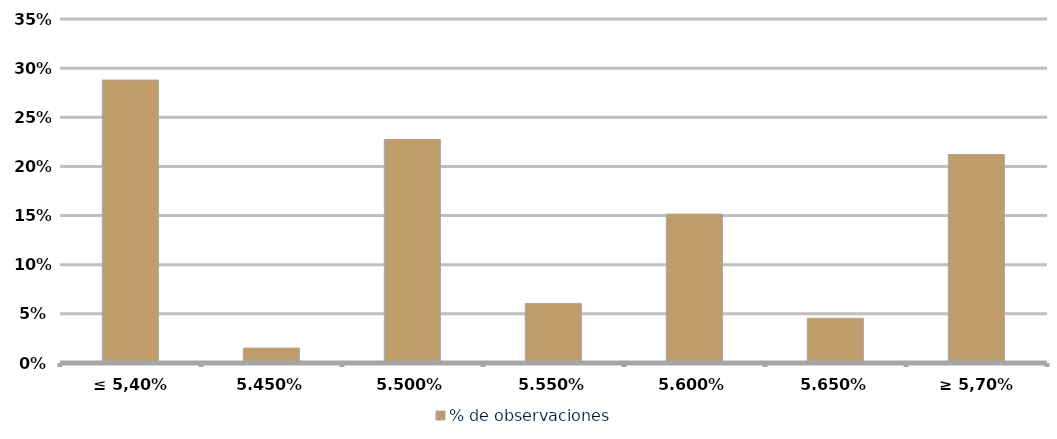
| Category | % de observaciones  |
|---|---|
| ≤ 5,40% | 0.288 |
| 5,45% | 0.015 |
| 5,50% | 0.227 |
| 5,55% | 0.061 |
| 5,60% | 0.152 |
| 5,65% | 0.045 |
| ≥ 5,70% | 0.212 |